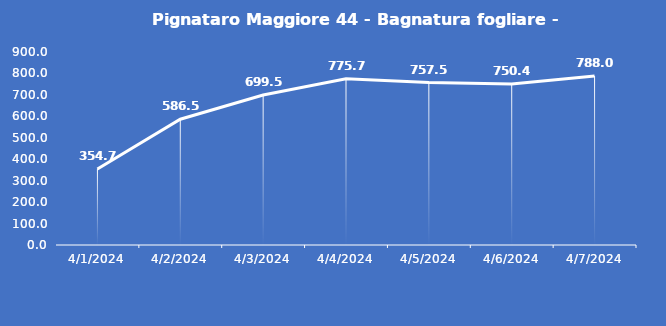
| Category | Pignataro Maggiore 44 - Bagnatura fogliare - Grezzo (min) |
|---|---|
| 4/1/24 | 354.7 |
| 4/2/24 | 586.5 |
| 4/3/24 | 699.5 |
| 4/4/24 | 775.7 |
| 4/5/24 | 757.5 |
| 4/6/24 | 750.4 |
| 4/7/24 | 788 |